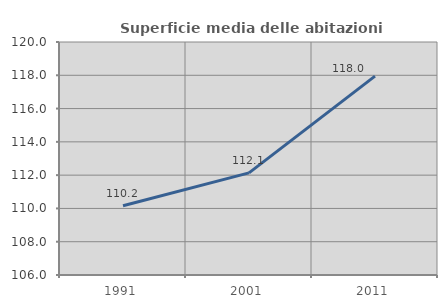
| Category | Superficie media delle abitazioni occupate |
|---|---|
| 1991.0 | 110.159 |
| 2001.0 | 112.136 |
| 2011.0 | 117.953 |